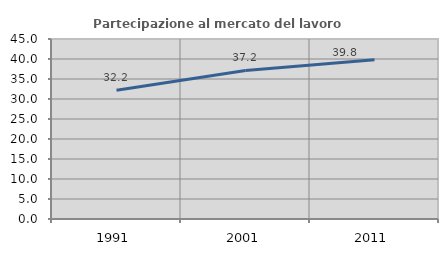
| Category | Partecipazione al mercato del lavoro  femminile |
|---|---|
| 1991.0 | 32.212 |
| 2001.0 | 37.15 |
| 2011.0 | 39.802 |